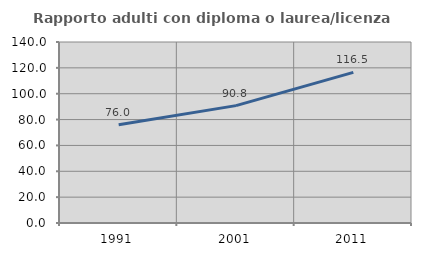
| Category | Rapporto adulti con diploma o laurea/licenza media  |
|---|---|
| 1991.0 | 76.044 |
| 2001.0 | 90.792 |
| 2011.0 | 116.511 |